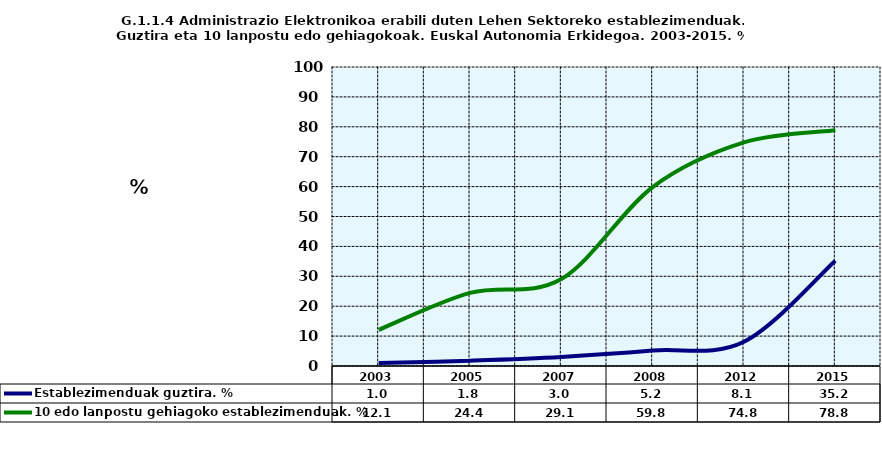
| Category | Establezimenduak guztira. % | 10 edo lanpostu gehiagoko establezimenduak. % |
|---|---|---|
| 2003.0 | 0.969 | 12.077 |
| 2005.0 | 1.791 | 24.444 |
| 2007.0 | 3.033 | 29.082 |
| 2008.0 | 5.176 | 59.848 |
| 2012.0 | 8.118 | 74.783 |
| 2015.0 | 35.191 | 78.832 |